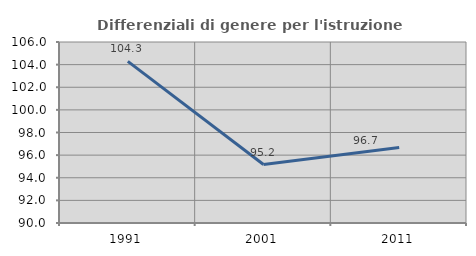
| Category | Differenziali di genere per l'istruzione superiore |
|---|---|
| 1991.0 | 104.29 |
| 2001.0 | 95.17 |
| 2011.0 | 96.678 |